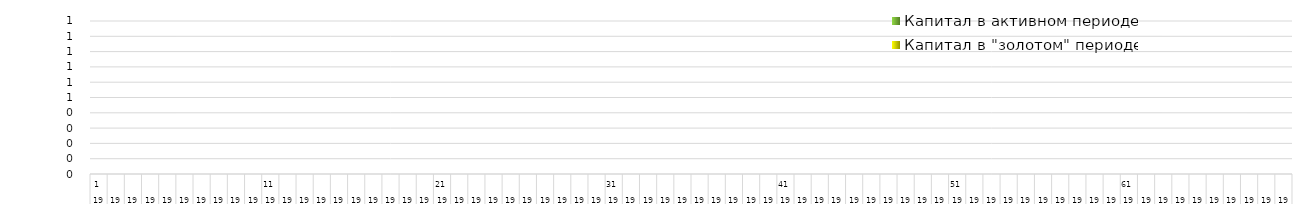
| Category | Капитал в активном периоде | Капитал в "золотом" периоде |
|---|---|---|
| 0 | 0 | 0 |
| 1 | 0 | 0 |
| 2 | 0 | 0 |
| 3 | 0 | 0 |
| 4 | 0 | 0 |
| 5 | 0 | 0 |
| 6 | 0 | 0 |
| 7 | 0 | 0 |
| 8 | 0 | 0 |
| 9 | 0 | 0 |
| 10 | 0 | 0 |
| 11 | 0 | 0 |
| 12 | 0 | 0 |
| 13 | 0 | 0 |
| 14 | 0 | 0 |
| 15 | 0 | 0 |
| 16 | 0 | 0 |
| 17 | 0 | 0 |
| 18 | 0 | 0 |
| 19 | 0 | 0 |
| 20 | 0 | 0 |
| 21 | 0 | 0 |
| 22 | 0 | 0 |
| 23 | 0 | 0 |
| 24 | 0 | 0 |
| 25 | 0 | 0 |
| 26 | 0 | 0 |
| 27 | 0 | 0 |
| 28 | 0 | 0 |
| 29 | 0 | 0 |
| 30 | 0 | 0 |
| 31 | 0 | 0 |
| 32 | 0 | 0 |
| 33 | 0 | 0 |
| 34 | 0 | 0 |
| 35 | 0 | 0 |
| 36 | 0 | 0 |
| 37 | 0 | 0 |
| 38 | 0 | 0 |
| 39 | 0 | 0 |
| 40 | 0 | 0 |
| 41 | 0 | 0 |
| 42 | 0 | 0 |
| 43 | 0 | 0 |
| 44 | 0 | 0 |
| 45 | 0 | 0 |
| 46 | 0 | 0 |
| 47 | 0 | 0 |
| 48 | 0 | 0 |
| 49 | 0 | 0 |
| 50 | 0 | 0 |
| 51 | 0 | 0 |
| 52 | 0 | 0 |
| 53 | 0 | 0 |
| 54 | 0 | 0 |
| 55 | 0 | 0 |
| 56 | 0 | 0 |
| 57 | 0 | 0 |
| 58 | 0 | 0 |
| 59 | 0 | 0 |
| 60 | 0 | 0 |
| 61 | 0 | 0 |
| 62 | 0 | 0 |
| 63 | 0 | 0 |
| 64 | 0 | 0 |
| 65 | 0 | 0 |
| 66 | 0 | 0 |
| 67 | 0 | 0 |
| 68 | 0 | 0 |
| 69 | 0 | 0 |